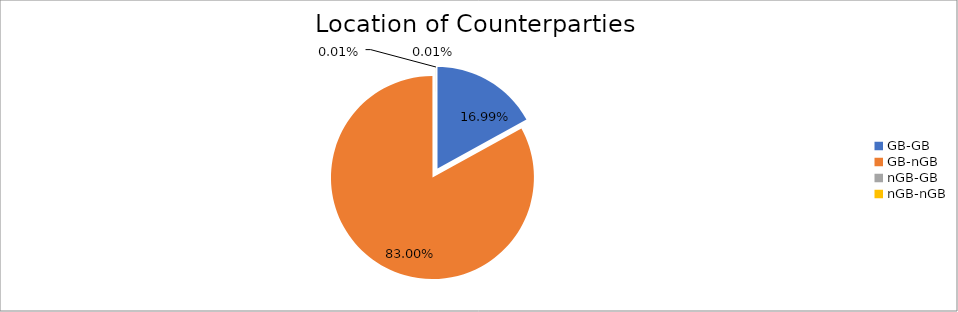
| Category | Series 0 |
|---|---|
| GB-GB | 1780768.476 |
| GB-nGB | 8700588.588 |
| nGB-GB | 776.542 |
| nGB-nGB | 586.919 |